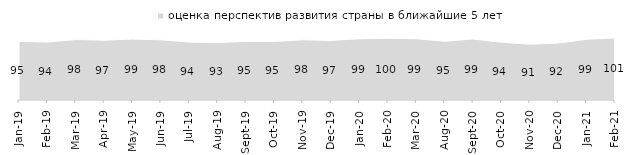
| Category | оценка перспектив развития страны в ближайшие 5 лет |
|---|---|
| 2019-01-01 | 95.25 |
| 2019-02-01 | 94.05 |
| 2019-03-01 | 98.11 |
| 2019-04-01 | 97.03 |
| 2019-05-01 | 98.91 |
| 2019-06-01 | 97.656 |
| 2019-07-01 | 94.01 |
| 2019-08-01 | 93.207 |
| 2019-09-01 | 95.099 |
| 2019-10-01 | 95 |
| 2019-11-01 | 97.673 |
| 2019-12-01 | 96.733 |
| 2020-01-01 | 99.356 |
| 2020-02-01 | 100.198 |
| 2020-03-01 | 99.455 |
| 2020-08-01 | 95.333 |
| 2020-09-01 | 99.054 |
| 2020-10-01 | 93.672 |
| 2020-11-01 | 90.55 |
| 2020-12-01 | 92.365 |
| 2021-01-01 | 98.51 |
| 2021-02-01 | 100.695 |